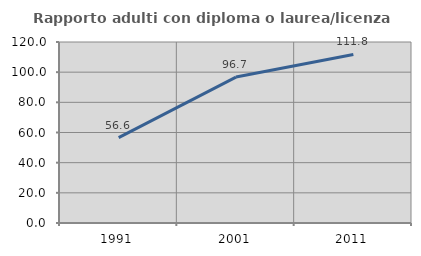
| Category | Rapporto adulti con diploma o laurea/licenza media  |
|---|---|
| 1991.0 | 56.633 |
| 2001.0 | 96.744 |
| 2011.0 | 111.765 |